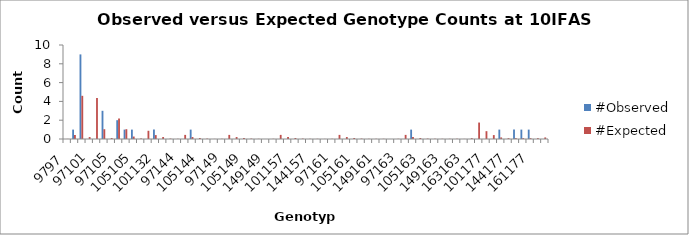
| Category | #Observed | #Expected |
|---|---|---|
| 9797.0 | 0 | 0.01 |
| 9799.0 | 1 | 0.438 |
| 9999.0 | 9 | 4.594 |
| 97101.0 | 0 | 0.208 |
| 99101.0 | 0 | 4.375 |
| 101101.0 | 3 | 1.042 |
| 97105.0 | 0 | 0.104 |
| 99105.0 | 2 | 2.188 |
| 101105.0 | 1 | 1.042 |
| 105105.0 | 1 | 0.26 |
| 97132.0 | 0 | 0.042 |
| 99132.0 | 0 | 0.875 |
| 101132.0 | 1 | 0.417 |
| 105132.0 | 0 | 0.208 |
| 132132.0 | 0 | 0.042 |
| 97144.0 | 0 | 0.021 |
| 99144.0 | 0 | 0.438 |
| 101144.0 | 1 | 0.208 |
| 105144.0 | 0 | 0.104 |
| 132144.0 | 0 | 0.042 |
| 144144.0 | 0 | 0.01 |
| 97149.0 | 0 | 0.021 |
| 99149.0 | 0 | 0.438 |
| 101149.0 | 0 | 0.208 |
| 105149.0 | 0 | 0.104 |
| 132149.0 | 0 | 0.042 |
| 144149.0 | 0 | 0.021 |
| 149149.0 | 0 | 0.01 |
| 97157.0 | 0 | 0.021 |
| 99157.0 | 0 | 0.438 |
| 101157.0 | 0 | 0.208 |
| 105157.0 | 0 | 0.104 |
| 132157.0 | 0 | 0.042 |
| 144157.0 | 0 | 0.021 |
| 149157.0 | 0 | 0.021 |
| 157157.0 | 0 | 0.01 |
| 97161.0 | 0 | 0.021 |
| 99161.0 | 0 | 0.438 |
| 101161.0 | 0 | 0.208 |
| 105161.0 | 0 | 0.104 |
| 132161.0 | 0 | 0.042 |
| 144161.0 | 0 | 0.021 |
| 149161.0 | 0 | 0.021 |
| 157161.0 | 0 | 0.021 |
| 161161.0 | 0 | 0.01 |
| 97163.0 | 0 | 0.021 |
| 99163.0 | 0 | 0.438 |
| 101163.0 | 1 | 0.208 |
| 105163.0 | 0 | 0.104 |
| 132163.0 | 0 | 0.042 |
| 144163.0 | 0 | 0.021 |
| 149163.0 | 0 | 0.021 |
| 157163.0 | 0 | 0.021 |
| 161163.0 | 0 | 0.021 |
| 163163.0 | 0 | 0.01 |
| 97177.0 | 0 | 0.083 |
| 99177.0 | 0 | 1.75 |
| 101177.0 | 0 | 0.833 |
| 105177.0 | 0 | 0.417 |
| 132177.0 | 1 | 0.167 |
| 144177.0 | 0 | 0.083 |
| 149177.0 | 1 | 0.083 |
| 157177.0 | 1 | 0.083 |
| 161177.0 | 1 | 0.083 |
| 163177.0 | 0 | 0.083 |
| 177177.0 | 0 | 0.167 |